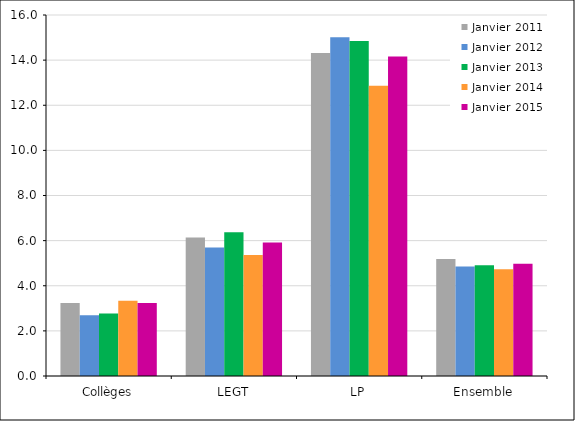
| Category | Janvier 2011 | Janvier 2012 | Janvier 2013 | Janvier 2014 | Janvier 2015 |
|---|---|---|---|---|---|
| Collèges | 3.239 | 2.693 | 2.772 | 3.341 | 3.237 |
| LEGT | 6.138 | 5.696 | 6.376 | 5.36 | 5.915 |
| LP | 14.319 | 15.01 | 14.844 | 12.869 | 14.156 |
| Ensemble | 5.181 | 4.849 | 4.904 | 4.73 | 4.976 |